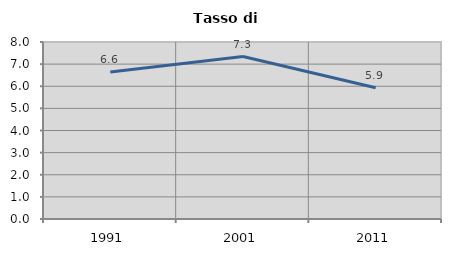
| Category | Tasso di disoccupazione   |
|---|---|
| 1991.0 | 6.642 |
| 2001.0 | 7.342 |
| 2011.0 | 5.93 |